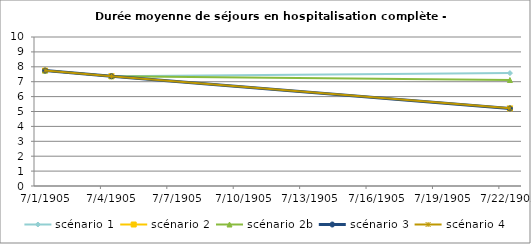
| Category | scénario 1 | scénario 2 | scénario 2b | scénario 3 | scénario 4 |
|---|---|---|---|---|---|
| 2009.0 | 7.749 | 7.749 | 7.749 | 7.749 | 7.749 |
| 2012.0 | 7.368 | 7.368 | 7.368 | 7.368 | 7.368 |
| 2030.0 | 7.578 | 5.207 | 7.115 | 5.207 | 5.217 |